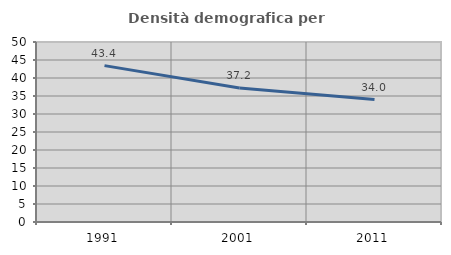
| Category | Densità demografica |
|---|---|
| 1991.0 | 43.441 |
| 2001.0 | 37.233 |
| 2011.0 | 34.007 |